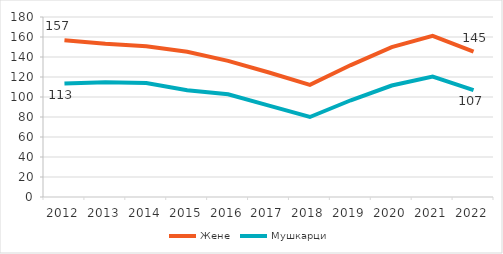
| Category | Жене | Мушкарци |
|---|---|---|
| 2012.0 | 156.779 | 113.477 |
| 2013.0 | 153.143 | 114.741 |
| 2014.0 | 150.676 | 114.007 |
| 2015.0 | 145.317 | 106.762 |
| 2016.0 | 136.099 | 102.775 |
| 2017.0 | 124.481 | 91.393 |
| 2018.0 | 112.202 | 79.992 |
| 2019.0 | 131.949 | 96.733 |
| 2020.0 | 149.948 | 111.499 |
| 2021.0 | 161.214 | 120.518 |
| 2022.0 | 145.356 | 106.922 |